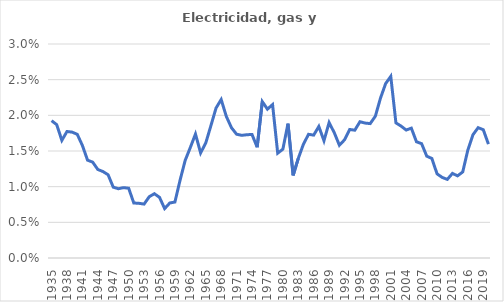
| Category | Electricidad, gas y agua |
|---|---|
| 1935.0 | 0.019 |
| 1936.0 | 0.019 |
| 1937.0 | 0.016 |
| 1938.0 | 0.018 |
| 1939.0 | 0.018 |
| 1940.0 | 0.017 |
| 1941.0 | 0.016 |
| 1942.0 | 0.014 |
| 1943.0 | 0.013 |
| 1944.0 | 0.012 |
| 1945.0 | 0.012 |
| 1946.0 | 0.012 |
| 1947.0 | 0.01 |
| 1948.0 | 0.01 |
| 1949.0 | 0.01 |
| 1950.0 | 0.01 |
| 1951.0 | 0.008 |
| 1952.0 | 0.008 |
| 1953.0 | 0.008 |
| 1954.0 | 0.009 |
| 1955.0 | 0.009 |
| 1956.0 | 0.009 |
| 1957.0 | 0.007 |
| 1958.0 | 0.008 |
| 1959.0 | 0.008 |
| 1960.0 | 0.011 |
| 1961.0 | 0.014 |
| 1962.0 | 0.015 |
| 1963.0 | 0.017 |
| 1964.0 | 0.015 |
| 1965.0 | 0.016 |
| 1966.0 | 0.019 |
| 1967.0 | 0.021 |
| 1968.0 | 0.022 |
| 1969.0 | 0.02 |
| 1970.0 | 0.018 |
| 1971.0 | 0.017 |
| 1972.0 | 0.017 |
| 1973.0 | 0.017 |
| 1974.0 | 0.017 |
| 1975.0 | 0.016 |
| 1976.0 | 0.022 |
| 1977.0 | 0.021 |
| 1978.0 | 0.022 |
| 1979.0 | 0.015 |
| 1980.0 | 0.015 |
| 1981.0 | 0.019 |
| 1982.0 | 0.012 |
| 1983.0 | 0.014 |
| 1984.0 | 0.016 |
| 1985.0 | 0.017 |
| 1986.0 | 0.017 |
| 1987.0 | 0.018 |
| 1988.0 | 0.016 |
| 1989.0 | 0.019 |
| 1990.0 | 0.018 |
| 1991.0 | 0.016 |
| 1992.0 | 0.017 |
| 1993.0 | 0.018 |
| 1994.0 | 0.018 |
| 1995.0 | 0.019 |
| 1996.0 | 0.019 |
| 1997.0 | 0.019 |
| 1998.0 | 0.02 |
| 1999.0 | 0.022 |
| 2000.0 | 0.024 |
| 2001.0 | 0.025 |
| 2002.0 | 0.019 |
| 2003.0 | 0.018 |
| 2004.0 | 0.018 |
| 2005.0 | 0.018 |
| 2006.0 | 0.016 |
| 2007.0 | 0.016 |
| 2008.0 | 0.014 |
| 2009.0 | 0.014 |
| 2010.0 | 0.012 |
| 2011.0 | 0.011 |
| 2012.0 | 0.011 |
| 2013.0 | 0.012 |
| 2014.0 | 0.012 |
| 2015.0 | 0.012 |
| 2016.0 | 0.015 |
| 2017.0 | 0.017 |
| 2018.0 | 0.018 |
| 2019.0 | 0.018 |
| 2020.0 | 0.016 |